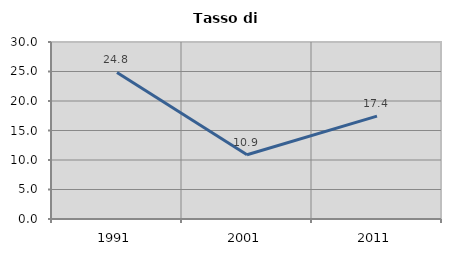
| Category | Tasso di disoccupazione   |
|---|---|
| 1991.0 | 24.843 |
| 2001.0 | 10.881 |
| 2011.0 | 17.433 |